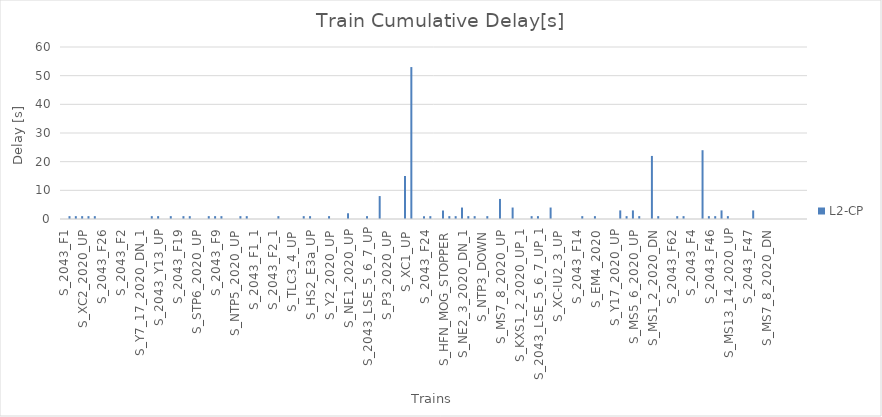
| Category | L2-CP |
|---|---|
| S_2043_F1 | 0 |
| S_EM2_2020_DN | 1 |
| S_Y5_2020_DN | 1 |
| S_XC2_2020_UP | 1 |
| S_NTP3_2020_UP | 1 |
| S_MS1_2_2020_UP | 1 |
| S_2043_F26 | 0 |
| S_TLC9_10_DN | 0 |
| S_EC1b_DOWN | 0 |
| S_2043_F2 | 0 |
| S_2043_F21a | 0 |
| S_2043_F49a | 0 |
| S_Y7_17_2020_DN_1 | 0 |
| S_NE8_2020_DN | 0 |
| S_TLC7_8_UP | 1 |
| S_2043_Y13_UP | 1 |
| S_HS2_E3a_DOWN | 0 |
| S_EM3_2020 | 1 |
| S_2043_F19 | 0 |
| S_NE8_2020_DN_1 | 1 |
| S_EC1b_UP | 1 |
| S_STP6_2020_UP | 0 |
| S_KXS1_2_2020_UP | 0 |
| S_NTP4_2020_UP | 1 |
| S_2043_F9 | 1 |
| S_TLC9_10_UP | 1 |
| S_2043_F23 | 0 |
| S_NTP5_2020_UP | 0 |
| S_NE2_3_2020_DN | 1 |
| S_Y6_2020_DN | 1 |
| S_2043_F1_1 | 0 |
| S_NTP4_2020_DN | 0 |
| S_EC-PM2a_DOWN | 0 |
| S_2043_F2_1 | 0 |
| S_2043_F63 | 1 |
| S_EC-PM2a_UP | 0 |
| S_TLC3_4_UP | 0 |
| S_2043_F25 | 0 |
| S_Y1_2020_UP | 1 |
| S_HS2_E3a_UP | 1 |
| S_2043_F1_2 | 0 |
| S_2043_F2_2 | 0 |
| S_Y2_2020_UP | 1 |
| S_EC-PM2b_DOWN | 0 |
| S_XC3_2020_UP | 0 |
| S_NE1_2020_UP | 2 |
| S_EC-PM4a_DOWN | 0 |
| S_EC-PM2b_UP | 0 |
| S_2043_LSE_5_6_7_UP | 1 |
| S_NE1_2020_DN | 0 |
| S_XC1_DOWN | 8 |
| S_P3_2020_UP | 0 |
| S_2043_F51 | 0 |
| S_2043_F15 | 0 |
| S_XC1_UP | 15 |
| S_EC7_2020_UP | 53 |
| S_NPR1b_DOWN | 0 |
| S_2043_F24 | 1 |
| S_Y15_16_2020_DOWN | 1 |
| S_2043_TL7_8_UP | 0 |
| S_HFN_MOG_STOPPER | 3 |
| S_MS1_2_2020_UP_1 | 1 |
| S_TLC1_2_UP | 1 |
| S_NE2_3_2020_DN_1 | 4 |
| S_2043_MS15_16_UP | 1 |
| S_NPR1b_UP | 1 |
| S_NTP3_DOWN | 0 |
| S_NE5_2020_UP | 1 |
| S_EC-PM4a_UP | 0 |
| S_MS7_8_2020_UP | 7 |
| S_NTP5_2020_UP_1 | 0 |
| S_Y5_2020_UP | 4 |
| S_KXS1_2_2020_UP_1 | 0 |
| S_2043_EC-PM3b-UP | 0 |
| S_NPR4c_UP | 1 |
| S_2043_LSE_5_6_7_UP_1 | 1 |
| S_XC-IU4_UP | 0 |
| S_Y6_2020_UP | 4 |
| S_XC-IU2_3_UP | 0 |
| S_XC-IU2_3_DOWN | 0 |
| S_Y7_2020_UP | 0 |
| S_2043_F14 | 0 |
| S_EM3_2020_1 | 1 |
| S_2043_F1_3 | 0 |
| S_EM4_2020 | 1 |
| S_NPR4c_DOWN | 0 |
| S_2043_TL7_8_UP_1 | 0 |
| S_Y17_2020_UP | 0 |
| S_MS9_10_2020_UP | 3 |
| S_2043_LSE_5_6_7_UP_2 | 1 |
| S_MS5_6_2020_UP | 3 |
| S_MS11_12_2020_UP | 1 |
| S_NPR1b_DOWN_1 | 0 |
| S_MS1_2_2020_DN | 22 |
| S_NTP3_UP | 1 |
| S_2043_F10 | 0 |
| S_2043_F62 | 0 |
| S_2043_F45 | 1 |
| S_NE9_2020_UP | 1 |
| S_2043_F4 | 0 |
| S_2043_F2_3 | 0 |
| S_MS3_4_2020_DN | 24 |
| S_2043_F46 | 1 |
| S_NE7_2020_UP | 1 |
| S_MS3_4_2020_UP | 3 |
| S_MS13_14_2020_UP | 1 |
| S_MOG_HFN_STOPPER | 0 |
| S_2043_MS15_16_DOWN | 0 |
| S_2043_F47 | 0 |
| S_HFN_MOG_STOPPER_1 | 3 |
| S_2043_F48 | 0 |
| S_MS7_8_2020_DN | 0 |